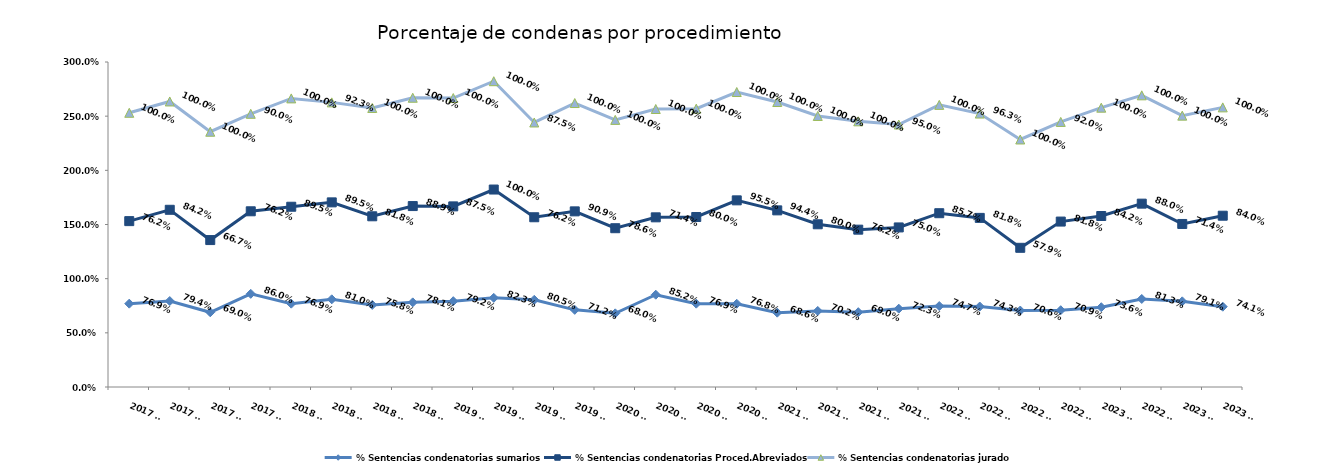
| Category | % Sentencias condenatorias sumarios | % Sentencias condenatorias Proced.Abreviados | % Sentencias condenatorias jurado |
|---|---|---|---|
| 2017 T1 | 0.769 | 0.762 | 1 |
| 2017 T2 | 0.794 | 0.842 | 1 |
| 2017 T3 | 0.69 | 0.667 | 1 |
| 2017 T4 | 0.86 | 0.762 | 0.9 |
| 2018 T1 | 0.769 | 0.895 | 1 |
| 2018 T2 | 0.81 | 0.895 | 0.923 |
| 2018 T3 | 0.758 | 0.818 | 1 |
| 2018 T4 | 0.781 | 0.889 | 1 |
| 2019 T1 | 0.792 | 0.875 | 1 |
| 2019 T2 | 0.823 | 1 | 1 |
| 2019 T3 | 0.805 | 0.762 | 0.875 |
| 2019 T4 | 0.712 | 0.909 | 1 |
| 2020 T1 | 0.68 | 0.786 | 1 |
| 2020 T2 | 0.852 | 0.714 | 1 |
| 2020 T3 | 0.769 | 0.8 | 1 |
| 2020 T4 | 0.768 | 0.955 | 1 |
| 2021 T1 | 0.686 | 0.944 | 1 |
| 2021 T2 | 0.702 | 0.8 | 1 |
| 2021 T3 | 0.69 | 0.762 | 1 |
| 2021 T4 | 0.723 | 0.75 | 0.95 |
| 2022 T1 | 0.747 | 0.857 | 1 |
| 2022 T2 | 0.743 | 0.818 | 0.963 |
| 2022 T3 | 0.706 | 0.579 | 1 |
| 2022 T4 | 0.709 | 0.818 | 0.92 |
| 2023 T1 | 0.736 | 0.842 | 1 |
| 2022 T2 | 0.812 | 0.88 | 1 |
| 2023 T3 | 0.791 | 0.714 | 1 |
| 2023 T4 | 0.741 | 0.84 | 1 |